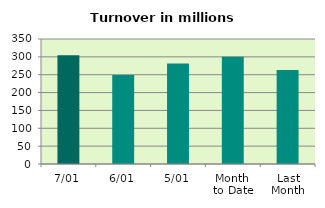
| Category | Series 0 |
|---|---|
| 7/01 | 304.597 |
| 6/01 | 249.177 |
| 5/01 | 281.068 |
| Month 
to Date | 300.395 |
| Last
Month | 263.133 |